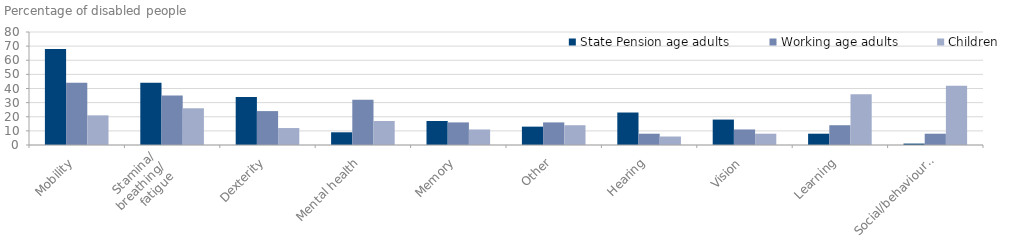
| Category | State Pension age adults | Working age adults | Children |
|---|---|---|---|
| Mobility | 68 | 44 | 21 |
| Stamina/
breathing/
fatigue | 44 | 35 | 26 |
| Dexterity | 34 | 24 | 12 |
| Mental health | 9 | 32 | 17 |
| Memory | 17 | 16 | 11 |
| Other | 13 | 16 | 14 |
| Hearing | 23 | 8 | 6 |
| Vision | 18 | 11 | 8 |
| Learning | 8 | 14 | 36 |
| Social/behavioural | 1 | 8 | 42 |